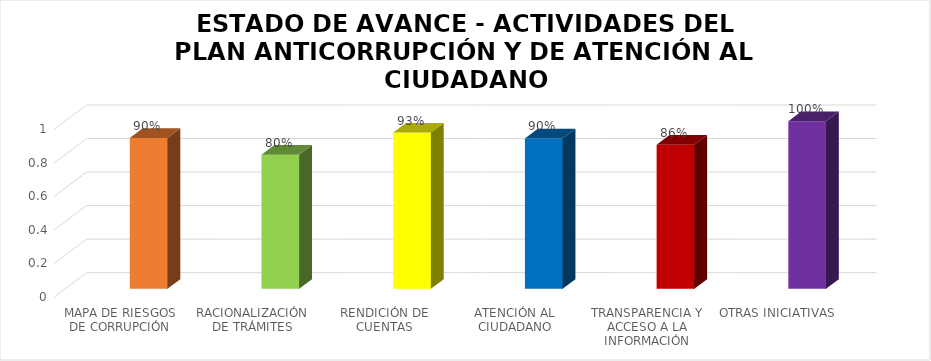
| Category | Series 0 | % AVANCE |
|---|---|---|
| MAPA DE RIESGOS DE CORRUPCIÓN |  | 0.9 |
| RACIONALIZACIÓN DE TRÁMITES |  | 0.8 |
| RENDICIÓN DE CUENTAS |  | 0.932 |
| ATENCIÓN AL CIUDADANO |  | 0.897 |
| TRANSPARENCIA Y ACCESO A LA INFORMACIÓN |  | 0.86 |
| OTRAS INICIATIVAS |  | 1 |